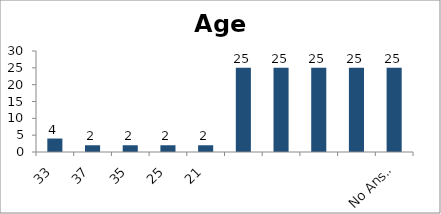
| Category | Age |
|---|---|
| 33 | 4 |
| 37 | 2 |
| 35 | 2 |
| 25 | 2 |
| 21 | 2 |
|  | 25 |
|  | 25 |
|  | 25 |
|  | 25 |
| No Answer | 25 |